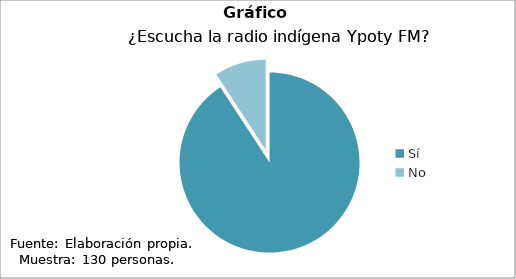
| Category | Series 0 |
|---|---|
| Sí | 118 |
| No | 12 |